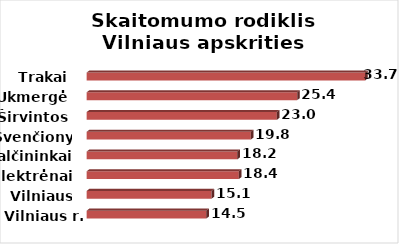
| Category | Series 0 |
|---|---|
| Vilniaus r. | 14.461 |
| Vilniaus m. | 15.081 |
| Elektrėnai | 18.388 |
| Šalčininkai | 18.213 |
| Švenčionys | 19.834 |
| Širvintos | 22.981 |
| Ukmergė | 25.439 |
| Trakai | 33.651 |